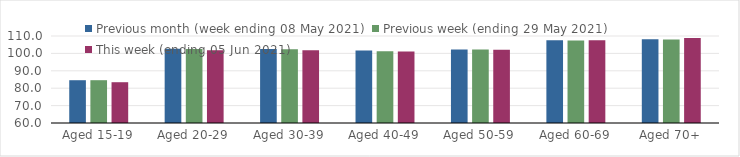
| Category | Previous month (week ending 08 May 2021) | Previous week (ending 29 May 2021) | This week (ending 05 Jun 2021) |
|---|---|---|---|
| Aged 15-19 | 84.59 | 84.6 | 83.44 |
| Aged 20-29 | 102.62 | 102.54 | 101.8 |
| Aged 30-39 | 102.48 | 102.35 | 101.83 |
| Aged 40-49 | 101.6 | 101.3 | 101.07 |
| Aged 50-59 | 102.27 | 102.22 | 102.15 |
| Aged 60-69 | 107.55 | 107.35 | 107.55 |
| Aged 70+ | 108.12 | 107.95 | 108.91 |